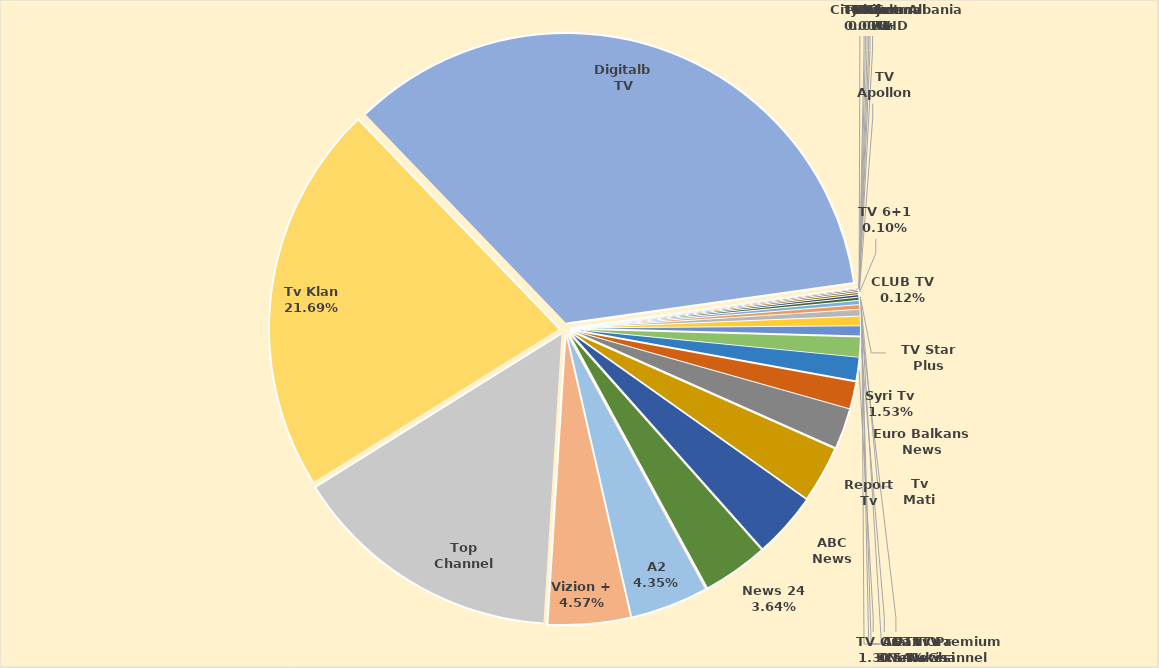
| Category | Të ardhura 2022 |
|---|---|
| TVT | 0 |
| City News Albania HD | 0 |
| In Tv | 0 |
| Panorama Tv | 210242 |
| Shijak Tv | 347039 |
| TV Sot 7 | 1869101 |
| TV Channel 1 | 4605285 |
| TV Apollon | 8025222 |
| TV 6+1 | 9904980 |
| CLUB TV | 11307650 |
| TV Star Plus | 13464616 |
| Tv Mati | 16898946 |
| Tv Premium Channel | 22152200 |
| TV Kukësi | 24814278 |
| Tv Ora News | 35062900 |
| ADTN | 51151078 |
| Fax News | 53924547 |
| TV Scan | 106662878 |
| TV Ora | 124075035 |
| Syri Tv | 145982192 |
| Euro Balkans News | 216141281 |
| Report Tv | 299795327 |
| ABC News | 346698061 |
| News 24 | 346906821 |
| A2 | 414768795 |
| Vizion + | 436336452 |
| Top Channel | 1443417716 |
| Tv Klan  | 2068823675 |
| Digitalb TV | 3335297685 |